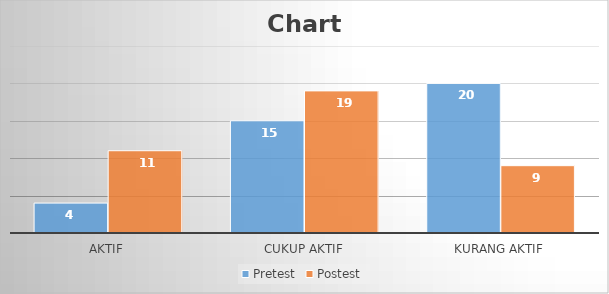
| Category | Pretest | Postest |
|---|---|---|
| Aktif | 4 | 11 |
| Cukup Aktif | 15 | 19 |
| Kurang Aktif | 20 | 9 |